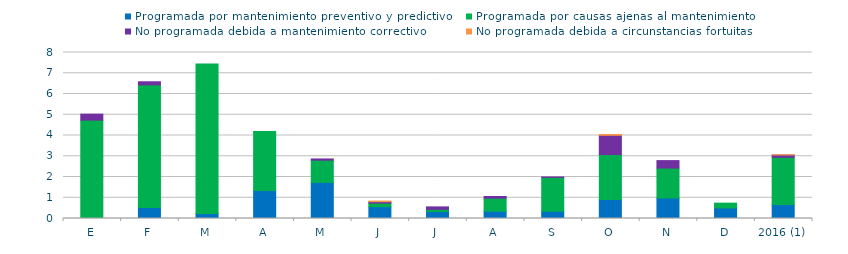
| Category | Programada por mantenimiento preventivo y predictivo | Programada por causas ajenas al mantenimiento  | No programada debida a mantenimiento correctivo  | No programada debida a circunstancias fortuitas  |
|---|---|---|---|---|
| E | 0 | 4.74 | 0.29 | 0 |
| F | 0.53 | 5.91 | 0.15 | 0 |
| M | 0.24 | 7.2 | 0 | 0 |
| A | 1.35 | 2.84 | 0 | 0 |
| M | 1.74 | 1.07 | 0.06 | 0 |
| J | 0.57 | 0.17 | 0.07 | 0.03 |
| J | 0.34 | 0.1 | 0.12 | 0 |
| A | 0.35 | 0.63 | 0.08 | 0 |
| S | 0.35 | 1.63 | 0.02 | 0 |
| O | 0.91 | 2.17 | 0.93 | 0.04 |
| N | 0.99 | 1.44 | 0.36 | 0 |
| D | 0.51 | 0.23 | 0 | 0 |
| 2016 (1) | 0.67 | 2.28 | 0.11 | 0.01 |